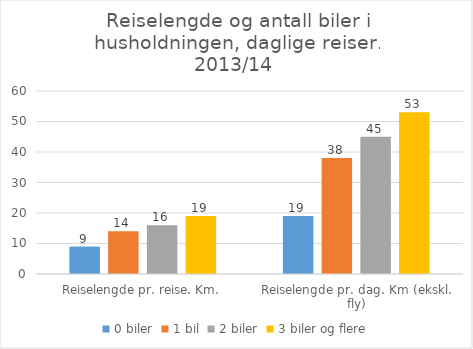
| Category | 0 biler | 1 bil | 2 biler | 3 biler og flere |
|---|---|---|---|---|
| Reiselengde pr. reise. Km. | 9 | 14 | 16 | 19 |
| Reiselengde pr. dag. Km (ekskl. fly) | 19 | 38 | 45 | 53 |